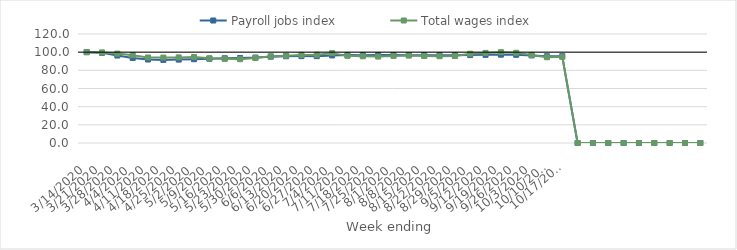
| Category | Payroll jobs index | Total wages index |
|---|---|---|
| 14/03/2020 | 100 | 100 |
| 21/03/2020 | 99.265 | 99.682 |
| 28/03/2020 | 96.284 | 98.406 |
| 04/04/2020 | 93.626 | 96.656 |
| 11/04/2020 | 91.924 | 94.154 |
| 18/04/2020 | 91.482 | 94.062 |
| 25/04/2020 | 91.821 | 94.245 |
| 02/05/2020 | 92.221 | 94.677 |
| 09/05/2020 | 92.772 | 93.304 |
| 16/05/2020 | 93.305 | 92.652 |
| 23/05/2020 | 93.609 | 92.272 |
| 30/05/2020 | 94.11 | 93.544 |
| 06/06/2020 | 95.034 | 95.442 |
| 13/06/2020 | 95.487 | 96.076 |
| 20/06/2020 | 95.645 | 96.966 |
| 27/06/2020 | 95.594 | 97.186 |
| 04/07/2020 | 96.409 | 98.934 |
| 11/07/2020 | 96.784 | 95.92 |
| 18/07/2020 | 96.696 | 95.473 |
| 25/07/2020 | 96.767 | 95.143 |
| 01/08/2020 | 96.854 | 95.856 |
| 08/08/2020 | 96.728 | 96.257 |
| 15/08/2020 | 96.62 | 95.754 |
| 22/08/2020 | 96.624 | 95.563 |
| 29/08/2020 | 96.609 | 95.684 |
| 05/09/2020 | 96.751 | 98.286 |
| 12/09/2020 | 97.054 | 99.176 |
| 19/09/2020 | 97.226 | 99.992 |
| 26/09/2020 | 97.1 | 99.309 |
| 03/10/2020 | 96.368 | 96.936 |
| 10/10/2020 | 95.514 | 94.424 |
| 17/10/2020 | 95.573 | 94.889 |